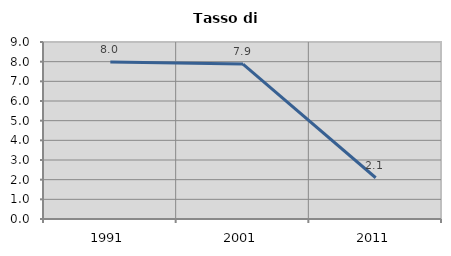
| Category | Tasso di disoccupazione   |
|---|---|
| 1991.0 | 7.985 |
| 2001.0 | 7.877 |
| 2011.0 | 2.098 |